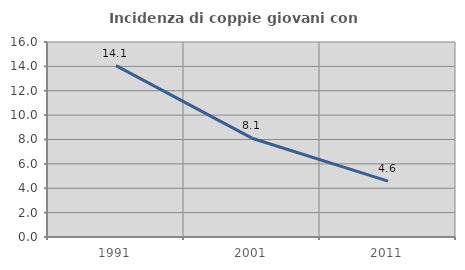
| Category | Incidenza di coppie giovani con figli |
|---|---|
| 1991.0 | 14.059 |
| 2001.0 | 8.107 |
| 2011.0 | 4.584 |